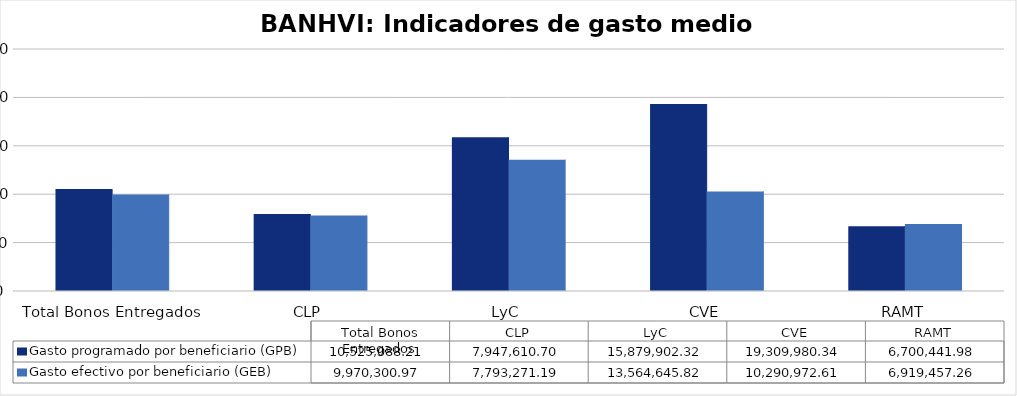
| Category | Gasto programado por beneficiario (GPB)  | Gasto efectivo por beneficiario (GEB)  |
|---|---|---|
| Total Bonos Entregados | 10525088.212 | 9970300.965 |
| CLP | 7947610.701 | 7793271.187 |
| LyC | 15879902.324 | 13564645.825 |
| CVE | 19309980.344 | 10290972.614 |
| RAMT | 6700441.984 | 6919457.259 |